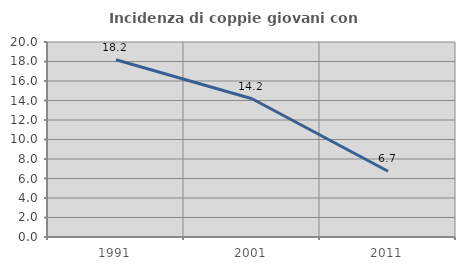
| Category | Incidenza di coppie giovani con figli |
|---|---|
| 1991.0 | 18.182 |
| 2001.0 | 14.174 |
| 2011.0 | 6.745 |